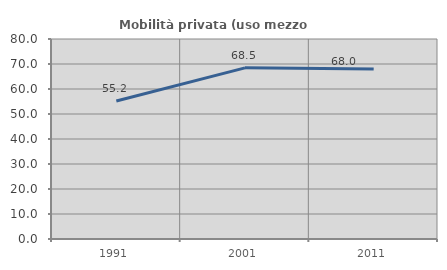
| Category | Mobilità privata (uso mezzo privato) |
|---|---|
| 1991.0 | 55.172 |
| 2001.0 | 68.466 |
| 2011.0 | 68.018 |